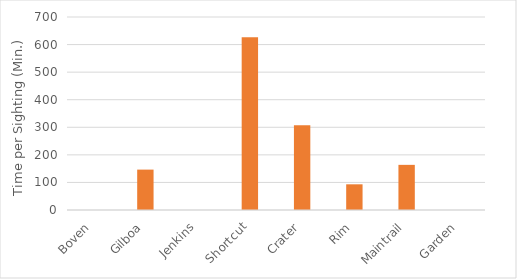
| Category | Time/Sightings |
|---|---|
| Boven | 0 |
| Gilboa | 146.5 |
| Jenkins | 0 |
| Shortcut | 627 |
| Crater | 307 |
| Rim | 93.154 |
| Maintrail | 163.727 |
| Garden | 0 |